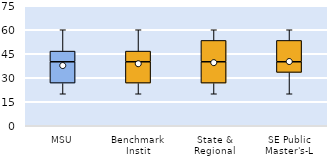
| Category | 25th | 50th | 75th |
|---|---|---|---|
| MSU | 26.667 | 13.333 | 6.667 |
| Benchmark Instit | 26.667 | 13.333 | 6.667 |
| State & Regional | 26.667 | 13.333 | 13.333 |
| SE Public Master's-L | 33.333 | 6.667 | 13.333 |